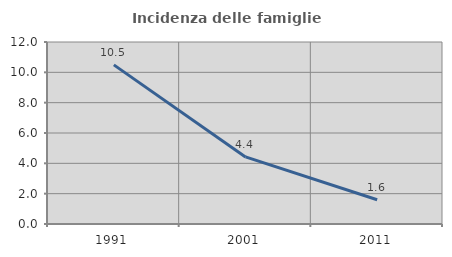
| Category | Incidenza delle famiglie numerose |
|---|---|
| 1991.0 | 10.491 |
| 2001.0 | 4.423 |
| 2011.0 | 1.597 |